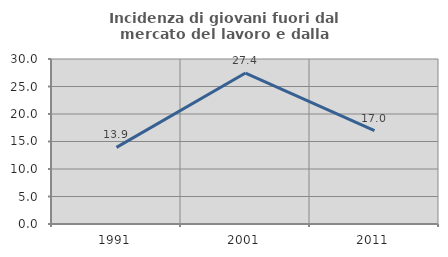
| Category | Incidenza di giovani fuori dal mercato del lavoro e dalla formazione  |
|---|---|
| 1991.0 | 13.931 |
| 2001.0 | 27.444 |
| 2011.0 | 16.993 |